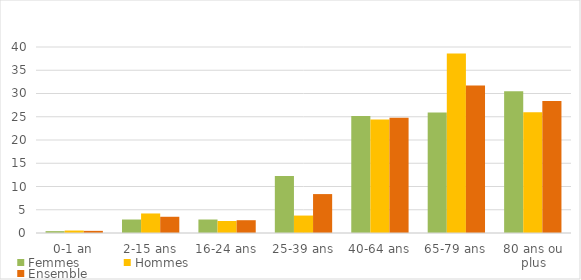
| Category | Femmes | Hommes | Ensemble |
|---|---|---|---|
| 0-1 an | 0.4 | 0.53 | 0.46 |
| 2-15 ans | 2.9 | 4.2 | 3.49 |
| 16-24 ans | 2.9 | 2.58 | 2.75 |
| 25-39 ans | 12.26 | 3.75 | 8.37 |
| 40-64 ans | 25.17 | 24.39 | 24.81 |
| 65-79 ans | 25.91 | 38.59 | 31.71 |
| 80 ans ou plus | 30.47 | 25.96 | 28.41 |